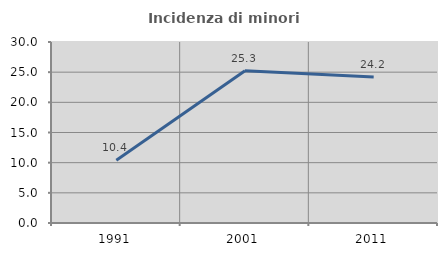
| Category | Incidenza di minori stranieri |
|---|---|
| 1991.0 | 10.396 |
| 2001.0 | 25.251 |
| 2011.0 | 24.195 |